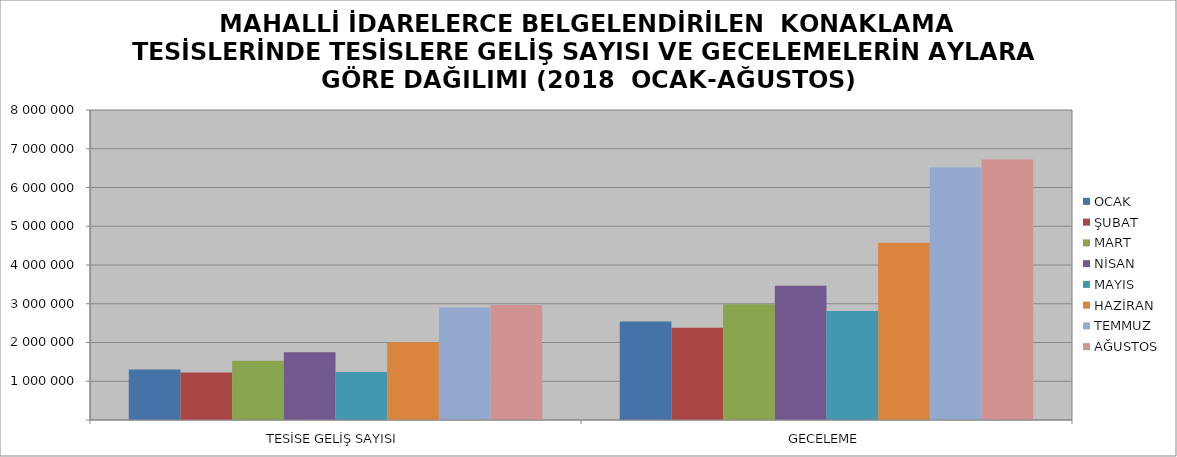
| Category | OCAK | ŞUBAT | MART | NİSAN | MAYIS | HAZİRAN | TEMMUZ | AĞUSTOS |
|---|---|---|---|---|---|---|---|---|
| TESİSE GELİŞ SAYISI | 1303353 | 1223475 | 1526172 | 1749085 | 1240889 | 2003881 | 2904028 | 2966995 |
| GECELEME | 2542103 | 2381300 | 2986820 | 3463261 | 2810808 | 4572629 | 6517690 | 6721558 |